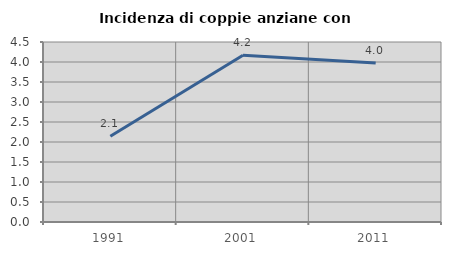
| Category | Incidenza di coppie anziane con figli |
|---|---|
| 1991.0 | 2.143 |
| 2001.0 | 4.167 |
| 2011.0 | 3.977 |